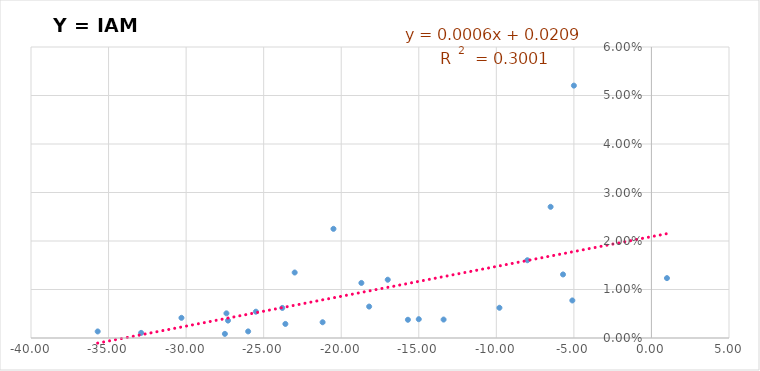
| Category | Y = IAM /año |
|---|---|
| -30.30000000000001 | 0.004 |
| -15.0 | 0.004 |
| -23.0 | 0.014 |
| -8.0 | 0.016 |
| -35.69999999999999 | 0.001 |
| -27.30000000000001 | 0.004 |
| -18.69999999999999 | 0.011 |
| -32.900000000000006 | 0.001 |
| -23.599999999999994 | 0.003 |
| -23.80000000000001 | 0.006 |
| -20.5 | 0.023 |
| -18.19999999999999 | 0.006 |
| -15.699999999999989 | 0.004 |
| -27.400000000000006 | 0.005 |
| -5.0 | 0.052 |
| -17.0 | 0.012 |
| 1.0 | 0.012 |
| -26.0 | 0.001 |
| -25.5 | 0.005 |
| -5.699999999999989 | 0.013 |
| -27.5 | 0.001 |
| -21.19999999999999 | 0.003 |
| -9.800000000000011 | 0.006 |
| -6.5 | 0.027 |
| -5.099999999999994 | 0.008 |
| -13.400000000000006 | 0.004 |